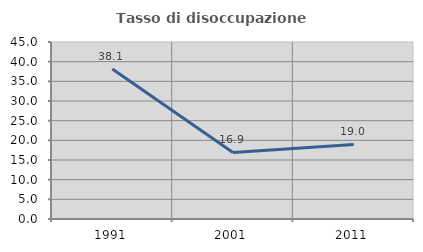
| Category | Tasso di disoccupazione giovanile  |
|---|---|
| 1991.0 | 38.136 |
| 2001.0 | 16.923 |
| 2011.0 | 18.966 |